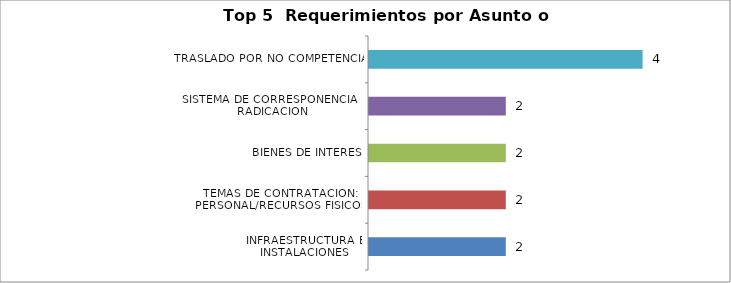
| Category | Total |
|---|---|
| INFRAESTRUCTURA E INSTALACIONES | 2 |
| TEMAS DE CONTRATACION: PERSONAL/RECURSOS FISICOS | 2 |
| BIENES DE INTERES | 2 |
| SISTEMA DE CORRESPONENCIA Y RADICACION | 2 |
| TRASLADO POR NO COMPETENCIA | 4 |